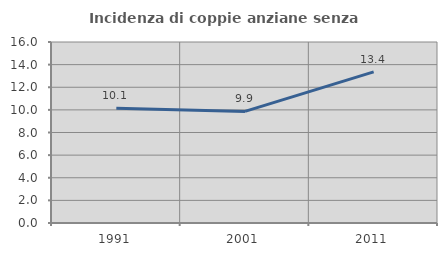
| Category | Incidenza di coppie anziane senza figli  |
|---|---|
| 1991.0 | 10.134 |
| 2001.0 | 9.863 |
| 2011.0 | 13.357 |